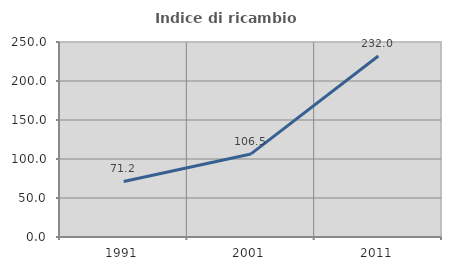
| Category | Indice di ricambio occupazionale  |
|---|---|
| 1991.0 | 71.17 |
| 2001.0 | 106.507 |
| 2011.0 | 232.015 |